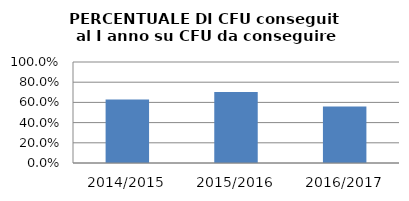
| Category | 2014/2015 2015/2016 2016/2017 |
|---|---|
| 2014/2015 | 0.628 |
| 2015/2016 | 0.704 |
| 2016/2017 | 0.56 |